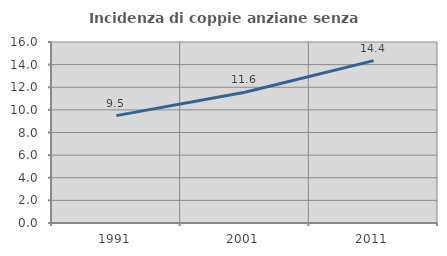
| Category | Incidenza di coppie anziane senza figli  |
|---|---|
| 1991.0 | 9.494 |
| 2001.0 | 11.56 |
| 2011.0 | 14.356 |